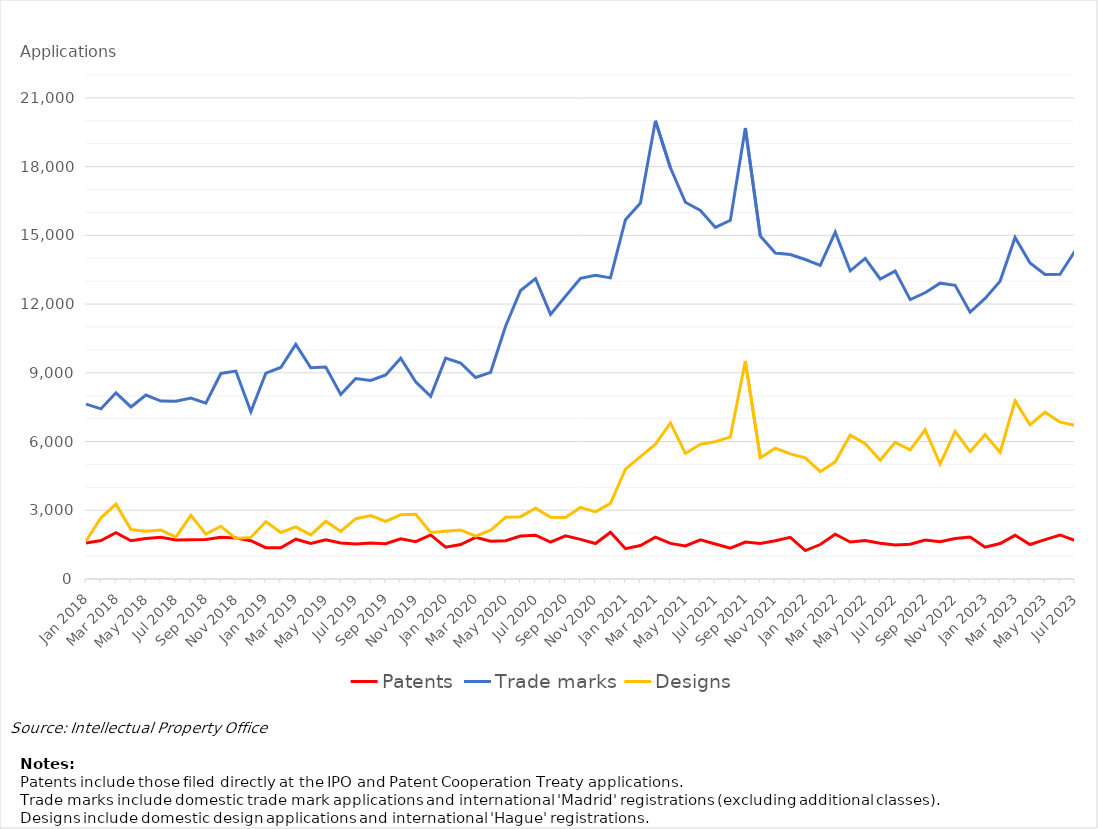
| Category | Patents | Trade marks | Designs |
|---|---|---|---|
| Jan 2018 | 1575 | 7634 | 1658 |
| Feb 2018 | 1676 | 7428 | 2672 |
| Mar 2018 | 2022 | 8127 | 3267 |
| Apr 2018 | 1670 | 7512 | 2160 |
| May 2018 | 1767 | 8030 | 2083 |
| Jun 2018 | 1821 | 7769 | 2136 |
| Jul 2018 | 1704 | 7757 | 1832 |
| Aug 2018 | 1713 | 7897 | 2777 |
| Sep 2018 | 1725 | 7673 | 1960 |
| Oct 2018 | 1818 | 8972 | 2302 |
| Nov 2018 | 1787 | 9076 | 1765 |
| Dec 2018 | 1670 | 7304 | 1815 |
| Jan 2019 | 1367 | 8985 | 2505 |
| Feb 2019 | 1361 | 9234 | 2031 |
| Mar 2019 | 1737 | 10243 | 2274 |
| Apr 2019 | 1552 | 9219 | 1923 |
| May 2019 | 1710 | 9251 | 2520 |
| Jun 2019 | 1569 | 8053 | 2074 |
| Jul 2019 | 1527 | 8752 | 2634 |
| Aug 2019 | 1571 | 8670 | 2768 |
| Sep 2019 | 1540 | 8908 | 2511 |
| Oct 2019 | 1755 | 9636 | 2800 |
| Nov 2019 | 1630 | 8607 | 2827 |
| Dec 2019 | 1926 | 7970 | 2028 |
| Jan 2020 | 1391 | 9642 | 2082 |
| Feb 2020 | 1504 | 9428 | 2143 |
| Mar 2020 | 1819 | 8794 | 1872 |
| Apr 2020 | 1648 | 9021 | 2127 |
| May 2020 | 1672 | 11035 | 2695 |
| Jun 2020 | 1879 | 12593 | 2721 |
| Jul 2020 | 1912 | 13110 | 3086 |
| Aug 2020 | 1613 | 11551 | 2695 |
| Sep 2020 | 1886 | 12340 | 2686 |
| Oct 2020 | 1730 | 13126 | 3124 |
| Nov 2020 | 1547 | 13254 | 2930 |
| Dec 2020 | 2042 | 13144 | 3302 |
| Jan 2021 | 1324 | 15685 | 4792 |
| Feb 2021 | 1462 | 16413 | 5340 |
| Mar 2021 | 1828 | 20001 | 5878 |
| Apr 2021 | 1554 | 17951 | 6815 |
| May 2021 | 1446 | 16446 | 5480 |
| Jun 2021 | 1712 | 16090 | 5881 |
| Jul 2021 | 1528 | 15345 | 5989 |
| Aug 2021 | 1344 | 15659 | 6200 |
| Sep 2021 | 1615 | 19685 | 9517 |
| Oct 2021 | 1547 | 14968 | 5292 |
| Nov 2021 | 1670 | 14232 | 5712 |
| Dec 2021 | 1817 | 14162 | 5464 |
| Jan 2022 | 1240 | 13945 | 5288 |
| Feb 2022 | 1505 | 13691 | 4683 |
| Mar 2022 | 1952 | 15142 | 5114 |
| Apr 2022 | 1616 | 13450 | 6282 |
| May 2022 | 1683 | 13992 | 5907 |
| Jun 2022 | 1561 | 13096 | 5183 |
| Jul 2022 | 1483 | 13439 | 5963 |
| Aug 2022 | 1520 | 12197 | 5639 |
| Sep 2022 | 1702 | 12493 | 6515 |
| Oct 2022 | 1630 | 12914 | 5012 |
| Nov 2022 | 1770 | 12819 | 6446 |
| Dec 2022 | 1828 | 11650 | 5558 |
| Jan 2023 | 1391 | 12250 | 6307 |
| Feb 2023 | 1551 | 13001 | 5528 |
| Mar 2023 | 1906 | 14909 | 7775 |
| Apr 2023 | 1506 | 13792 | 6735 |
| May 2023 | 1718 | 13292 | 7281 |
| Jun 2023 | 1922 | 13300 | 6847 |
| Jul 2023 | 1679 | 14316 | 6708 |